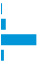
| Category | Series 0 |
|---|---|
| 0 | 0.001 |
| 1 | 0.094 |
| 2 | 0.859 |
| 3 | 0.047 |